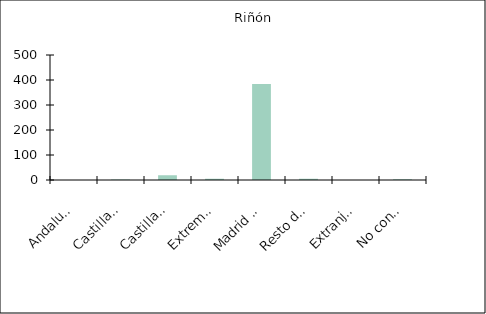
| Category | Riñón |
|---|---|
|    Andalucía | 0 |
|    Castilla y León | 2 |
|    Castilla-La Mancha | 19 |
|    Extremadura | 5 |
|    Madrid (Comunidad de) | 384 |
|    Resto de CCAA | 5 |
|    Extranjero | 0 |
|    No consta | 3 |